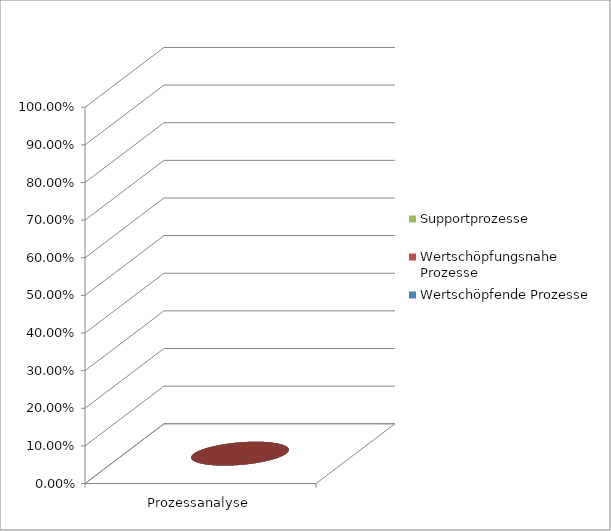
| Category | Wertschöpfende Prozesse | Wertschöpfungsnahe Prozesse | Supportprozesse |
|---|---|---|---|
| Prozessanalyse | 0 | 0 | 0 |